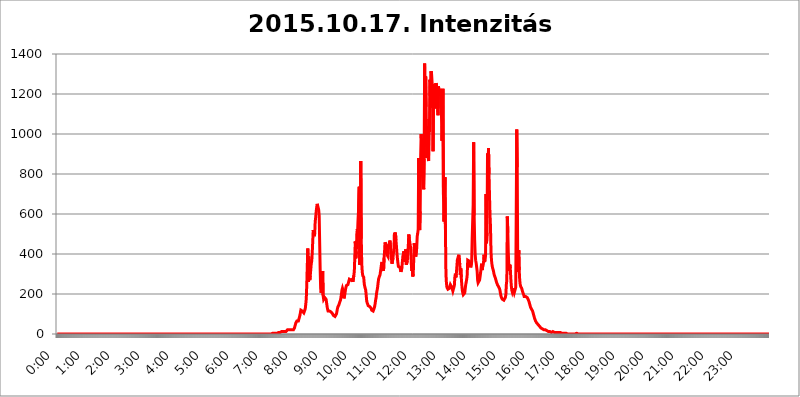
| Category | 2015.10.17. Intenzitás [W/m^2] |
|---|---|
| 0.0 | 0 |
| 0.0006944444444444445 | 0 |
| 0.001388888888888889 | 0 |
| 0.0020833333333333333 | 0 |
| 0.002777777777777778 | 0 |
| 0.003472222222222222 | 0 |
| 0.004166666666666667 | 0 |
| 0.004861111111111111 | 0 |
| 0.005555555555555556 | 0 |
| 0.0062499999999999995 | 0 |
| 0.006944444444444444 | 0 |
| 0.007638888888888889 | 0 |
| 0.008333333333333333 | 0 |
| 0.009027777777777779 | 0 |
| 0.009722222222222222 | 0 |
| 0.010416666666666666 | 0 |
| 0.011111111111111112 | 0 |
| 0.011805555555555555 | 0 |
| 0.012499999999999999 | 0 |
| 0.013194444444444444 | 0 |
| 0.013888888888888888 | 0 |
| 0.014583333333333332 | 0 |
| 0.015277777777777777 | 0 |
| 0.015972222222222224 | 0 |
| 0.016666666666666666 | 0 |
| 0.017361111111111112 | 0 |
| 0.018055555555555557 | 0 |
| 0.01875 | 0 |
| 0.019444444444444445 | 0 |
| 0.02013888888888889 | 0 |
| 0.020833333333333332 | 0 |
| 0.02152777777777778 | 0 |
| 0.022222222222222223 | 0 |
| 0.02291666666666667 | 0 |
| 0.02361111111111111 | 0 |
| 0.024305555555555556 | 0 |
| 0.024999999999999998 | 0 |
| 0.025694444444444447 | 0 |
| 0.02638888888888889 | 0 |
| 0.027083333333333334 | 0 |
| 0.027777777777777776 | 0 |
| 0.02847222222222222 | 0 |
| 0.029166666666666664 | 0 |
| 0.029861111111111113 | 0 |
| 0.030555555555555555 | 0 |
| 0.03125 | 0 |
| 0.03194444444444445 | 0 |
| 0.03263888888888889 | 0 |
| 0.03333333333333333 | 0 |
| 0.034027777777777775 | 0 |
| 0.034722222222222224 | 0 |
| 0.035416666666666666 | 0 |
| 0.036111111111111115 | 0 |
| 0.03680555555555556 | 0 |
| 0.0375 | 0 |
| 0.03819444444444444 | 0 |
| 0.03888888888888889 | 0 |
| 0.03958333333333333 | 0 |
| 0.04027777777777778 | 0 |
| 0.04097222222222222 | 0 |
| 0.041666666666666664 | 0 |
| 0.042361111111111106 | 0 |
| 0.04305555555555556 | 0 |
| 0.043750000000000004 | 0 |
| 0.044444444444444446 | 0 |
| 0.04513888888888889 | 0 |
| 0.04583333333333334 | 0 |
| 0.04652777777777778 | 0 |
| 0.04722222222222222 | 0 |
| 0.04791666666666666 | 0 |
| 0.04861111111111111 | 0 |
| 0.049305555555555554 | 0 |
| 0.049999999999999996 | 0 |
| 0.05069444444444445 | 0 |
| 0.051388888888888894 | 0 |
| 0.052083333333333336 | 0 |
| 0.05277777777777778 | 0 |
| 0.05347222222222222 | 0 |
| 0.05416666666666667 | 0 |
| 0.05486111111111111 | 0 |
| 0.05555555555555555 | 0 |
| 0.05625 | 0 |
| 0.05694444444444444 | 0 |
| 0.057638888888888885 | 0 |
| 0.05833333333333333 | 0 |
| 0.05902777777777778 | 0 |
| 0.059722222222222225 | 0 |
| 0.06041666666666667 | 0 |
| 0.061111111111111116 | 0 |
| 0.06180555555555556 | 0 |
| 0.0625 | 0 |
| 0.06319444444444444 | 0 |
| 0.06388888888888888 | 0 |
| 0.06458333333333334 | 0 |
| 0.06527777777777778 | 0 |
| 0.06597222222222222 | 0 |
| 0.06666666666666667 | 0 |
| 0.06736111111111111 | 0 |
| 0.06805555555555555 | 0 |
| 0.06874999999999999 | 0 |
| 0.06944444444444443 | 0 |
| 0.07013888888888889 | 0 |
| 0.07083333333333333 | 0 |
| 0.07152777777777779 | 0 |
| 0.07222222222222223 | 0 |
| 0.07291666666666667 | 0 |
| 0.07361111111111111 | 0 |
| 0.07430555555555556 | 0 |
| 0.075 | 0 |
| 0.07569444444444444 | 0 |
| 0.0763888888888889 | 0 |
| 0.07708333333333334 | 0 |
| 0.07777777777777778 | 0 |
| 0.07847222222222222 | 0 |
| 0.07916666666666666 | 0 |
| 0.0798611111111111 | 0 |
| 0.08055555555555556 | 0 |
| 0.08125 | 0 |
| 0.08194444444444444 | 0 |
| 0.08263888888888889 | 0 |
| 0.08333333333333333 | 0 |
| 0.08402777777777777 | 0 |
| 0.08472222222222221 | 0 |
| 0.08541666666666665 | 0 |
| 0.08611111111111112 | 0 |
| 0.08680555555555557 | 0 |
| 0.08750000000000001 | 0 |
| 0.08819444444444445 | 0 |
| 0.08888888888888889 | 0 |
| 0.08958333333333333 | 0 |
| 0.09027777777777778 | 0 |
| 0.09097222222222222 | 0 |
| 0.09166666666666667 | 0 |
| 0.09236111111111112 | 0 |
| 0.09305555555555556 | 0 |
| 0.09375 | 0 |
| 0.09444444444444444 | 0 |
| 0.09513888888888888 | 0 |
| 0.09583333333333333 | 0 |
| 0.09652777777777777 | 0 |
| 0.09722222222222222 | 0 |
| 0.09791666666666667 | 0 |
| 0.09861111111111111 | 0 |
| 0.09930555555555555 | 0 |
| 0.09999999999999999 | 0 |
| 0.10069444444444443 | 0 |
| 0.1013888888888889 | 0 |
| 0.10208333333333335 | 0 |
| 0.10277777777777779 | 0 |
| 0.10347222222222223 | 0 |
| 0.10416666666666667 | 0 |
| 0.10486111111111111 | 0 |
| 0.10555555555555556 | 0 |
| 0.10625 | 0 |
| 0.10694444444444444 | 0 |
| 0.1076388888888889 | 0 |
| 0.10833333333333334 | 0 |
| 0.10902777777777778 | 0 |
| 0.10972222222222222 | 0 |
| 0.1111111111111111 | 0 |
| 0.11180555555555556 | 0 |
| 0.11180555555555556 | 0 |
| 0.1125 | 0 |
| 0.11319444444444444 | 0 |
| 0.11388888888888889 | 0 |
| 0.11458333333333333 | 0 |
| 0.11527777777777777 | 0 |
| 0.11597222222222221 | 0 |
| 0.11666666666666665 | 0 |
| 0.1173611111111111 | 0 |
| 0.11805555555555557 | 0 |
| 0.11944444444444445 | 0 |
| 0.12013888888888889 | 0 |
| 0.12083333333333333 | 0 |
| 0.12152777777777778 | 0 |
| 0.12222222222222223 | 0 |
| 0.12291666666666667 | 0 |
| 0.12291666666666667 | 0 |
| 0.12361111111111112 | 0 |
| 0.12430555555555556 | 0 |
| 0.125 | 0 |
| 0.12569444444444444 | 0 |
| 0.12638888888888888 | 0 |
| 0.12708333333333333 | 0 |
| 0.16875 | 0 |
| 0.12847222222222224 | 0 |
| 0.12916666666666668 | 0 |
| 0.12986111111111112 | 0 |
| 0.13055555555555556 | 0 |
| 0.13125 | 0 |
| 0.13194444444444445 | 0 |
| 0.1326388888888889 | 0 |
| 0.13333333333333333 | 0 |
| 0.13402777777777777 | 0 |
| 0.13402777777777777 | 0 |
| 0.13472222222222222 | 0 |
| 0.13541666666666666 | 0 |
| 0.1361111111111111 | 0 |
| 0.13749999999999998 | 0 |
| 0.13819444444444443 | 0 |
| 0.1388888888888889 | 0 |
| 0.13958333333333334 | 0 |
| 0.14027777777777778 | 0 |
| 0.14097222222222222 | 0 |
| 0.14166666666666666 | 0 |
| 0.1423611111111111 | 0 |
| 0.14305555555555557 | 0 |
| 0.14375000000000002 | 0 |
| 0.14444444444444446 | 0 |
| 0.1451388888888889 | 0 |
| 0.1451388888888889 | 0 |
| 0.14652777777777778 | 0 |
| 0.14722222222222223 | 0 |
| 0.14791666666666667 | 0 |
| 0.1486111111111111 | 0 |
| 0.14930555555555555 | 0 |
| 0.15 | 0 |
| 0.15069444444444444 | 0 |
| 0.15138888888888888 | 0 |
| 0.15208333333333332 | 0 |
| 0.15277777777777776 | 0 |
| 0.15347222222222223 | 0 |
| 0.15416666666666667 | 0 |
| 0.15486111111111112 | 0 |
| 0.15555555555555556 | 0 |
| 0.15625 | 0 |
| 0.15694444444444444 | 0 |
| 0.15763888888888888 | 0 |
| 0.15833333333333333 | 0 |
| 0.15902777777777777 | 0 |
| 0.15972222222222224 | 0 |
| 0.16041666666666668 | 0 |
| 0.16111111111111112 | 0 |
| 0.16180555555555556 | 0 |
| 0.1625 | 0 |
| 0.16319444444444445 | 0 |
| 0.1638888888888889 | 0 |
| 0.16458333333333333 | 0 |
| 0.16527777777777777 | 0 |
| 0.16597222222222222 | 0 |
| 0.16666666666666666 | 0 |
| 0.1673611111111111 | 0 |
| 0.16805555555555554 | 0 |
| 0.16874999999999998 | 0 |
| 0.16944444444444443 | 0 |
| 0.17013888888888887 | 0 |
| 0.1708333333333333 | 0 |
| 0.17152777777777775 | 0 |
| 0.17222222222222225 | 0 |
| 0.1729166666666667 | 0 |
| 0.17361111111111113 | 0 |
| 0.17430555555555557 | 0 |
| 0.17500000000000002 | 0 |
| 0.17569444444444446 | 0 |
| 0.1763888888888889 | 0 |
| 0.17708333333333334 | 0 |
| 0.17777777777777778 | 0 |
| 0.17847222222222223 | 0 |
| 0.17916666666666667 | 0 |
| 0.1798611111111111 | 0 |
| 0.18055555555555555 | 0 |
| 0.18125 | 0 |
| 0.18194444444444444 | 0 |
| 0.1826388888888889 | 0 |
| 0.18333333333333335 | 0 |
| 0.1840277777777778 | 0 |
| 0.18472222222222223 | 0 |
| 0.18541666666666667 | 0 |
| 0.18611111111111112 | 0 |
| 0.18680555555555556 | 0 |
| 0.1875 | 0 |
| 0.18819444444444444 | 0 |
| 0.18888888888888888 | 0 |
| 0.18958333333333333 | 0 |
| 0.19027777777777777 | 0 |
| 0.1909722222222222 | 0 |
| 0.19166666666666665 | 0 |
| 0.19236111111111112 | 0 |
| 0.19305555555555554 | 0 |
| 0.19375 | 0 |
| 0.19444444444444445 | 0 |
| 0.1951388888888889 | 0 |
| 0.19583333333333333 | 0 |
| 0.19652777777777777 | 0 |
| 0.19722222222222222 | 0 |
| 0.19791666666666666 | 0 |
| 0.1986111111111111 | 0 |
| 0.19930555555555554 | 0 |
| 0.19999999999999998 | 0 |
| 0.20069444444444443 | 0 |
| 0.20138888888888887 | 0 |
| 0.2020833333333333 | 0 |
| 0.2027777777777778 | 0 |
| 0.2034722222222222 | 0 |
| 0.2041666666666667 | 0 |
| 0.20486111111111113 | 0 |
| 0.20555555555555557 | 0 |
| 0.20625000000000002 | 0 |
| 0.20694444444444446 | 0 |
| 0.2076388888888889 | 0 |
| 0.20833333333333334 | 0 |
| 0.20902777777777778 | 0 |
| 0.20972222222222223 | 0 |
| 0.21041666666666667 | 0 |
| 0.2111111111111111 | 0 |
| 0.21180555555555555 | 0 |
| 0.2125 | 0 |
| 0.21319444444444444 | 0 |
| 0.2138888888888889 | 0 |
| 0.21458333333333335 | 0 |
| 0.2152777777777778 | 0 |
| 0.21597222222222223 | 0 |
| 0.21666666666666667 | 0 |
| 0.21736111111111112 | 0 |
| 0.21805555555555556 | 0 |
| 0.21875 | 0 |
| 0.21944444444444444 | 0 |
| 0.22013888888888888 | 0 |
| 0.22083333333333333 | 0 |
| 0.22152777777777777 | 0 |
| 0.2222222222222222 | 0 |
| 0.22291666666666665 | 0 |
| 0.2236111111111111 | 0 |
| 0.22430555555555556 | 0 |
| 0.225 | 0 |
| 0.22569444444444445 | 0 |
| 0.2263888888888889 | 0 |
| 0.22708333333333333 | 0 |
| 0.22777777777777777 | 0 |
| 0.22847222222222222 | 0 |
| 0.22916666666666666 | 0 |
| 0.2298611111111111 | 0 |
| 0.23055555555555554 | 0 |
| 0.23124999999999998 | 0 |
| 0.23194444444444443 | 0 |
| 0.23263888888888887 | 0 |
| 0.2333333333333333 | 0 |
| 0.2340277777777778 | 0 |
| 0.2347222222222222 | 0 |
| 0.2354166666666667 | 0 |
| 0.23611111111111113 | 0 |
| 0.23680555555555557 | 0 |
| 0.23750000000000002 | 0 |
| 0.23819444444444446 | 0 |
| 0.2388888888888889 | 0 |
| 0.23958333333333334 | 0 |
| 0.24027777777777778 | 0 |
| 0.24097222222222223 | 0 |
| 0.24166666666666667 | 0 |
| 0.2423611111111111 | 0 |
| 0.24305555555555555 | 0 |
| 0.24375 | 0 |
| 0.24444444444444446 | 0 |
| 0.24513888888888888 | 0 |
| 0.24583333333333335 | 0 |
| 0.2465277777777778 | 0 |
| 0.24722222222222223 | 0 |
| 0.24791666666666667 | 0 |
| 0.24861111111111112 | 0 |
| 0.24930555555555556 | 0 |
| 0.25 | 0 |
| 0.25069444444444444 | 0 |
| 0.2513888888888889 | 0 |
| 0.2520833333333333 | 0 |
| 0.25277777777777777 | 0 |
| 0.2534722222222222 | 0 |
| 0.25416666666666665 | 0 |
| 0.2548611111111111 | 0 |
| 0.2555555555555556 | 0 |
| 0.25625000000000003 | 0 |
| 0.2569444444444445 | 0 |
| 0.2576388888888889 | 0 |
| 0.25833333333333336 | 0 |
| 0.2590277777777778 | 0 |
| 0.25972222222222224 | 0 |
| 0.2604166666666667 | 0 |
| 0.2611111111111111 | 0 |
| 0.26180555555555557 | 0 |
| 0.2625 | 0 |
| 0.26319444444444445 | 0 |
| 0.2638888888888889 | 0 |
| 0.26458333333333334 | 0 |
| 0.2652777777777778 | 0 |
| 0.2659722222222222 | 0 |
| 0.26666666666666666 | 0 |
| 0.2673611111111111 | 0 |
| 0.26805555555555555 | 0 |
| 0.26875 | 0 |
| 0.26944444444444443 | 0 |
| 0.2701388888888889 | 0 |
| 0.2708333333333333 | 0 |
| 0.27152777777777776 | 0 |
| 0.2722222222222222 | 0 |
| 0.27291666666666664 | 0 |
| 0.2736111111111111 | 0 |
| 0.2743055555555555 | 0 |
| 0.27499999999999997 | 0 |
| 0.27569444444444446 | 0 |
| 0.27638888888888885 | 0 |
| 0.27708333333333335 | 0 |
| 0.2777777777777778 | 0 |
| 0.27847222222222223 | 0 |
| 0.2791666666666667 | 0 |
| 0.2798611111111111 | 0 |
| 0.28055555555555556 | 0 |
| 0.28125 | 0 |
| 0.28194444444444444 | 0 |
| 0.2826388888888889 | 0 |
| 0.2833333333333333 | 0 |
| 0.28402777777777777 | 0 |
| 0.2847222222222222 | 0 |
| 0.28541666666666665 | 0 |
| 0.28611111111111115 | 0 |
| 0.28680555555555554 | 0 |
| 0.28750000000000003 | 0 |
| 0.2881944444444445 | 0 |
| 0.2888888888888889 | 0 |
| 0.28958333333333336 | 0 |
| 0.2902777777777778 | 0 |
| 0.29097222222222224 | 0 |
| 0.2916666666666667 | 0 |
| 0.2923611111111111 | 0 |
| 0.29305555555555557 | 0 |
| 0.29375 | 0 |
| 0.29444444444444445 | 0 |
| 0.2951388888888889 | 0 |
| 0.29583333333333334 | 0 |
| 0.2965277777777778 | 0 |
| 0.2972222222222222 | 0 |
| 0.29791666666666666 | 0 |
| 0.2986111111111111 | 0 |
| 0.29930555555555555 | 0 |
| 0.3 | 0 |
| 0.30069444444444443 | 3.525 |
| 0.3013888888888889 | 3.525 |
| 0.3020833333333333 | 3.525 |
| 0.30277777777777776 | 3.525 |
| 0.3034722222222222 | 3.525 |
| 0.30416666666666664 | 3.525 |
| 0.3048611111111111 | 3.525 |
| 0.3055555555555555 | 3.525 |
| 0.30624999999999997 | 3.525 |
| 0.3069444444444444 | 3.525 |
| 0.3076388888888889 | 3.525 |
| 0.30833333333333335 | 3.525 |
| 0.3090277777777778 | 7.887 |
| 0.30972222222222223 | 3.525 |
| 0.3104166666666667 | 7.887 |
| 0.3111111111111111 | 7.887 |
| 0.31180555555555556 | 7.887 |
| 0.3125 | 7.887 |
| 0.31319444444444444 | 12.257 |
| 0.3138888888888889 | 12.257 |
| 0.3145833333333333 | 12.257 |
| 0.31527777777777777 | 12.257 |
| 0.3159722222222222 | 12.257 |
| 0.31666666666666665 | 12.257 |
| 0.31736111111111115 | 12.257 |
| 0.31805555555555554 | 12.257 |
| 0.31875000000000003 | 12.257 |
| 0.3194444444444445 | 12.257 |
| 0.3201388888888889 | 12.257 |
| 0.32083333333333336 | 12.257 |
| 0.3215277777777778 | 16.636 |
| 0.32222222222222224 | 16.636 |
| 0.3229166666666667 | 21.024 |
| 0.3236111111111111 | 21.024 |
| 0.32430555555555557 | 21.024 |
| 0.325 | 21.024 |
| 0.32569444444444445 | 21.024 |
| 0.3263888888888889 | 25.419 |
| 0.32708333333333334 | 21.024 |
| 0.3277777777777778 | 21.024 |
| 0.3284722222222222 | 21.024 |
| 0.32916666666666666 | 21.024 |
| 0.3298611111111111 | 16.636 |
| 0.33055555555555555 | 16.636 |
| 0.33125 | 21.024 |
| 0.33194444444444443 | 21.024 |
| 0.3326388888888889 | 29.823 |
| 0.3333333333333333 | 38.653 |
| 0.3340277777777778 | 47.511 |
| 0.3347222222222222 | 56.398 |
| 0.3354166666666667 | 60.85 |
| 0.3361111111111111 | 65.31 |
| 0.3368055555555556 | 65.31 |
| 0.33749999999999997 | 65.31 |
| 0.33819444444444446 | 65.31 |
| 0.33888888888888885 | 74.246 |
| 0.33958333333333335 | 83.205 |
| 0.34027777777777773 | 92.184 |
| 0.34097222222222223 | 105.69 |
| 0.3416666666666666 | 119.235 |
| 0.3423611111111111 | 123.758 |
| 0.3430555555555555 | 119.235 |
| 0.34375 | 114.716 |
| 0.3444444444444445 | 110.201 |
| 0.3451388888888889 | 110.201 |
| 0.3458333333333334 | 105.69 |
| 0.34652777777777777 | 110.201 |
| 0.34722222222222227 | 119.235 |
| 0.34791666666666665 | 128.284 |
| 0.34861111111111115 | 150.964 |
| 0.34930555555555554 | 178.264 |
| 0.35000000000000003 | 251.251 |
| 0.3506944444444444 | 255.813 |
| 0.3513888888888889 | 427.39 |
| 0.3520833333333333 | 260.373 |
| 0.3527777777777778 | 387.202 |
| 0.3534722222222222 | 314.98 |
| 0.3541666666666667 | 269.49 |
| 0.3548611111111111 | 292.259 |
| 0.35555555555555557 | 287.709 |
| 0.35625 | 351.198 |
| 0.35694444444444445 | 364.728 |
| 0.3576388888888889 | 405.108 |
| 0.35833333333333334 | 462.786 |
| 0.3590277777777778 | 519.555 |
| 0.3597222222222222 | 506.542 |
| 0.36041666666666666 | 489.108 |
| 0.3611111111111111 | 502.192 |
| 0.36180555555555555 | 562.53 |
| 0.3625 | 583.779 |
| 0.36319444444444443 | 613.252 |
| 0.3638888888888889 | 634.105 |
| 0.3645833333333333 | 650.667 |
| 0.3652777777777778 | 642.4 |
| 0.3659722222222222 | 638.256 |
| 0.3666666666666667 | 621.613 |
| 0.3673611111111111 | 592.233 |
| 0.3680555555555556 | 592.233 |
| 0.36874999999999997 | 324.052 |
| 0.36944444444444446 | 228.436 |
| 0.37013888888888885 | 205.62 |
| 0.37083333333333335 | 223.873 |
| 0.37152777777777773 | 274.047 |
| 0.37222222222222223 | 314.98 |
| 0.3729166666666666 | 191.937 |
| 0.3736111111111111 | 173.709 |
| 0.3743055555555555 | 173.709 |
| 0.375 | 182.82 |
| 0.3756944444444445 | 187.378 |
| 0.3763888888888889 | 182.82 |
| 0.3770833333333334 | 173.709 |
| 0.37777777777777777 | 155.509 |
| 0.37847222222222227 | 137.347 |
| 0.37916666666666665 | 123.758 |
| 0.37986111111111115 | 114.716 |
| 0.38055555555555554 | 114.716 |
| 0.38125000000000003 | 114.716 |
| 0.3819444444444444 | 114.716 |
| 0.3826388888888889 | 110.201 |
| 0.3833333333333333 | 110.201 |
| 0.3840277777777778 | 110.201 |
| 0.3847222222222222 | 105.69 |
| 0.3854166666666667 | 105.69 |
| 0.3861111111111111 | 101.184 |
| 0.38680555555555557 | 96.682 |
| 0.3875 | 92.184 |
| 0.38819444444444445 | 87.692 |
| 0.3888888888888889 | 87.692 |
| 0.38958333333333334 | 87.692 |
| 0.3902777777777778 | 92.184 |
| 0.3909722222222222 | 92.184 |
| 0.39166666666666666 | 101.184 |
| 0.3923611111111111 | 114.716 |
| 0.39305555555555555 | 128.284 |
| 0.39375 | 137.347 |
| 0.39444444444444443 | 141.884 |
| 0.3951388888888889 | 146.423 |
| 0.3958333333333333 | 155.509 |
| 0.3965277777777778 | 160.056 |
| 0.3972222222222222 | 169.156 |
| 0.3979166666666667 | 182.82 |
| 0.3986111111111111 | 201.058 |
| 0.3993055555555556 | 219.309 |
| 0.39999999999999997 | 228.436 |
| 0.40069444444444446 | 219.309 |
| 0.40138888888888885 | 191.937 |
| 0.40208333333333335 | 178.264 |
| 0.40277777777777773 | 187.378 |
| 0.40347222222222223 | 201.058 |
| 0.4041666666666666 | 219.309 |
| 0.4048611111111111 | 233 |
| 0.4055555555555555 | 242.127 |
| 0.40625 | 246.689 |
| 0.4069444444444445 | 246.689 |
| 0.4076388888888889 | 246.689 |
| 0.4083333333333334 | 251.251 |
| 0.40902777777777777 | 264.932 |
| 0.40972222222222227 | 274.047 |
| 0.41041666666666665 | 278.603 |
| 0.41111111111111115 | 278.603 |
| 0.41180555555555554 | 269.49 |
| 0.41250000000000003 | 269.49 |
| 0.4131944444444444 | 274.047 |
| 0.4138888888888889 | 274.047 |
| 0.4145833333333333 | 260.373 |
| 0.4152777777777778 | 264.932 |
| 0.4159722222222222 | 292.259 |
| 0.4166666666666667 | 314.98 |
| 0.4173611111111111 | 319.517 |
| 0.41805555555555557 | 462.786 |
| 0.41875 | 378.224 |
| 0.41944444444444445 | 414.035 |
| 0.4201388888888889 | 497.836 |
| 0.42083333333333334 | 523.88 |
| 0.4215277777777778 | 502.192 |
| 0.4222222222222222 | 497.836 |
| 0.42291666666666666 | 497.836 |
| 0.4236111111111111 | 735.89 |
| 0.42430555555555555 | 346.682 |
| 0.425 | 427.39 |
| 0.42569444444444443 | 864.493 |
| 0.4263888888888889 | 475.972 |
| 0.4270833333333333 | 351.198 |
| 0.4277777777777778 | 310.44 |
| 0.4284722222222222 | 292.259 |
| 0.4291666666666667 | 296.808 |
| 0.4298611111111111 | 283.156 |
| 0.4305555555555556 | 251.251 |
| 0.43124999999999997 | 237.564 |
| 0.43194444444444446 | 233 |
| 0.43263888888888885 | 219.309 |
| 0.43333333333333335 | 191.937 |
| 0.43402777777777773 | 164.605 |
| 0.43472222222222223 | 155.509 |
| 0.4354166666666666 | 150.964 |
| 0.4361111111111111 | 141.884 |
| 0.4368055555555555 | 137.347 |
| 0.4375 | 137.347 |
| 0.4381944444444445 | 137.347 |
| 0.4388888888888889 | 141.884 |
| 0.4395833333333334 | 141.884 |
| 0.44027777777777777 | 128.284 |
| 0.44097222222222227 | 119.235 |
| 0.44166666666666665 | 119.235 |
| 0.44236111111111115 | 119.235 |
| 0.44305555555555554 | 114.716 |
| 0.44375000000000003 | 119.235 |
| 0.4444444444444444 | 128.284 |
| 0.4451388888888889 | 137.347 |
| 0.4458333333333333 | 150.964 |
| 0.4465277777777778 | 169.156 |
| 0.4472222222222222 | 182.82 |
| 0.4479166666666667 | 205.62 |
| 0.4486111111111111 | 219.309 |
| 0.44930555555555557 | 233 |
| 0.45 | 255.813 |
| 0.45069444444444445 | 274.047 |
| 0.4513888888888889 | 283.156 |
| 0.45208333333333334 | 278.603 |
| 0.4527777777777778 | 296.808 |
| 0.4534722222222222 | 314.98 |
| 0.45416666666666666 | 333.113 |
| 0.4548611111111111 | 351.198 |
| 0.45555555555555555 | 360.221 |
| 0.45625 | 337.639 |
| 0.45694444444444443 | 333.113 |
| 0.4576388888888889 | 314.98 |
| 0.4583333333333333 | 378.224 |
| 0.4590277777777778 | 409.574 |
| 0.4597222222222222 | 458.38 |
| 0.4604166666666667 | 458.38 |
| 0.4611111111111111 | 445.129 |
| 0.4618055555555556 | 422.943 |
| 0.46249999999999997 | 396.164 |
| 0.46319444444444446 | 391.685 |
| 0.46388888888888885 | 387.202 |
| 0.46458333333333335 | 436.27 |
| 0.46527777777777773 | 440.702 |
| 0.46597222222222223 | 458.38 |
| 0.4666666666666666 | 467.187 |
| 0.4673611111111111 | 436.27 |
| 0.4680555555555555 | 414.035 |
| 0.46875 | 378.224 |
| 0.4694444444444445 | 351.198 |
| 0.4701388888888889 | 355.712 |
| 0.4708333333333334 | 378.224 |
| 0.47152777777777777 | 405.108 |
| 0.47222222222222227 | 427.39 |
| 0.47291666666666665 | 506.542 |
| 0.47361111111111115 | 489.108 |
| 0.47430555555555554 | 506.542 |
| 0.47500000000000003 | 471.582 |
| 0.4756944444444444 | 440.702 |
| 0.4763888888888889 | 405.108 |
| 0.4770833333333333 | 378.224 |
| 0.4777777777777778 | 355.712 |
| 0.4784722222222222 | 337.639 |
| 0.4791666666666667 | 333.113 |
| 0.4798611111111111 | 337.639 |
| 0.48055555555555557 | 333.113 |
| 0.48125 | 324.052 |
| 0.48194444444444445 | 310.44 |
| 0.4826388888888889 | 314.98 |
| 0.48333333333333334 | 328.584 |
| 0.4840277777777778 | 360.221 |
| 0.4847222222222222 | 387.202 |
| 0.48541666666666666 | 391.685 |
| 0.4861111111111111 | 414.035 |
| 0.48680555555555555 | 409.574 |
| 0.4875 | 387.202 |
| 0.48819444444444443 | 360.221 |
| 0.4888888888888889 | 422.943 |
| 0.4895833333333333 | 346.682 |
| 0.4902777777777778 | 351.198 |
| 0.4909722222222222 | 364.728 |
| 0.4916666666666667 | 405.108 |
| 0.4923611111111111 | 440.702 |
| 0.4930555555555556 | 497.836 |
| 0.49374999999999997 | 475.972 |
| 0.49444444444444446 | 458.38 |
| 0.49513888888888885 | 445.129 |
| 0.49583333333333335 | 414.035 |
| 0.49652777777777773 | 355.712 |
| 0.49722222222222223 | 314.98 |
| 0.4979166666666666 | 324.052 |
| 0.4986111111111111 | 287.709 |
| 0.4993055555555555 | 301.354 |
| 0.5 | 373.729 |
| 0.5006944444444444 | 453.968 |
| 0.5013888888888889 | 427.39 |
| 0.5020833333333333 | 414.035 |
| 0.5027777777777778 | 387.202 |
| 0.5034722222222222 | 382.715 |
| 0.5041666666666667 | 431.833 |
| 0.5048611111111111 | 489.108 |
| 0.5055555555555555 | 502.192 |
| 0.50625 | 523.88 |
| 0.5069444444444444 | 879.719 |
| 0.5076388888888889 | 592.233 |
| 0.5083333333333333 | 519.555 |
| 0.5090277777777777 | 613.252 |
| 0.5097222222222222 | 891.099 |
| 0.5104166666666666 | 999.916 |
| 0.5111111111111112 | 947.58 |
| 0.5118055555555555 | 925.06 |
| 0.5125000000000001 | 826.123 |
| 0.5131944444444444 | 860.676 |
| 0.513888888888889 | 723.889 |
| 0.5145833333333333 | 875.918 |
| 0.5152777777777778 | 1352.994 |
| 0.5159722222222222 | 992.448 |
| 0.5166666666666667 | 1287.761 |
| 0.517361111111111 | 1135.543 |
| 0.5180555555555556 | 879.719 |
| 0.5187499999999999 | 1037.277 |
| 0.5194444444444445 | 928.819 |
| 0.5201388888888888 | 887.309 |
| 0.5208333333333334 | 864.493 |
| 0.5215277777777778 | 1074.789 |
| 0.5222222222222223 | 1011.118 |
| 0.5229166666666667 | 1270.964 |
| 0.5236111111111111 | 1131.708 |
| 0.5243055555555556 | 1313.406 |
| 0.525 | 1300.514 |
| 0.5256944444444445 | 1258.511 |
| 0.5263888888888889 | 1229.899 |
| 0.5270833333333333 | 913.766 |
| 0.5277777777777778 | 1221.83 |
| 0.5284722222222222 | 1250.275 |
| 0.5291666666666667 | 1238.014 |
| 0.5298611111111111 | 1233.951 |
| 0.5305555555555556 | 1127.879 |
| 0.53125 | 1254.387 |
| 0.5319444444444444 | 1242.089 |
| 0.5326388888888889 | 1217.812 |
| 0.5333333333333333 | 1213.804 |
| 0.5340277777777778 | 1093.653 |
| 0.5347222222222222 | 1238.014 |
| 0.5354166666666667 | 1213.804 |
| 0.5361111111111111 | 1189.969 |
| 0.5368055555555555 | 1217.812 |
| 0.5375 | 1225.859 |
| 0.5381944444444444 | 1225.859 |
| 0.5388888888888889 | 1093.653 |
| 0.5395833333333333 | 966.295 |
| 0.5402777777777777 | 1056.004 |
| 0.5409722222222222 | 1225.859 |
| 0.5416666666666666 | 695.666 |
| 0.5423611111111112 | 562.53 |
| 0.5430555555555555 | 566.793 |
| 0.5437500000000001 | 783.342 |
| 0.5444444444444444 | 519.555 |
| 0.545138888888889 | 301.354 |
| 0.5458333333333333 | 255.813 |
| 0.5465277777777778 | 233 |
| 0.5472222222222222 | 228.436 |
| 0.5479166666666667 | 223.873 |
| 0.548611111111111 | 219.309 |
| 0.5493055555555556 | 223.873 |
| 0.5499999999999999 | 228.436 |
| 0.5506944444444445 | 233 |
| 0.5513888888888888 | 246.689 |
| 0.5520833333333334 | 251.251 |
| 0.5527777777777778 | 237.564 |
| 0.5534722222222223 | 233 |
| 0.5541666666666667 | 223.873 |
| 0.5548611111111111 | 214.746 |
| 0.5555555555555556 | 210.182 |
| 0.55625 | 219.309 |
| 0.5569444444444445 | 242.127 |
| 0.5576388888888889 | 283.156 |
| 0.5583333333333333 | 301.354 |
| 0.5590277777777778 | 283.156 |
| 0.5597222222222222 | 301.354 |
| 0.5604166666666667 | 333.113 |
| 0.5611111111111111 | 369.23 |
| 0.5618055555555556 | 378.224 |
| 0.5625 | 387.202 |
| 0.5631944444444444 | 396.164 |
| 0.5638888888888889 | 391.685 |
| 0.5645833333333333 | 346.682 |
| 0.5652777777777778 | 296.808 |
| 0.5659722222222222 | 328.584 |
| 0.5666666666666667 | 283.156 |
| 0.5673611111111111 | 246.689 |
| 0.5680555555555555 | 219.309 |
| 0.56875 | 205.62 |
| 0.5694444444444444 | 196.497 |
| 0.5701388888888889 | 191.937 |
| 0.5708333333333333 | 196.497 |
| 0.5715277777777777 | 205.62 |
| 0.5722222222222222 | 228.436 |
| 0.5729166666666666 | 246.689 |
| 0.5736111111111112 | 260.373 |
| 0.5743055555555555 | 274.047 |
| 0.5750000000000001 | 296.808 |
| 0.5756944444444444 | 369.23 |
| 0.576388888888889 | 373.729 |
| 0.5770833333333333 | 369.23 |
| 0.5777777777777778 | 364.728 |
| 0.5784722222222222 | 351.198 |
| 0.5791666666666667 | 342.162 |
| 0.579861111111111 | 333.113 |
| 0.5805555555555556 | 337.639 |
| 0.5812499999999999 | 360.221 |
| 0.5819444444444445 | 475.972 |
| 0.5826388888888888 | 480.356 |
| 0.5833333333333334 | 646.537 |
| 0.5840277777777778 | 958.814 |
| 0.5847222222222223 | 592.233 |
| 0.5854166666666667 | 471.582 |
| 0.5861111111111111 | 400.638 |
| 0.5868055555555556 | 369.23 |
| 0.5875 | 355.712 |
| 0.5881944444444445 | 355.712 |
| 0.5888888888888889 | 314.98 |
| 0.5895833333333333 | 269.49 |
| 0.5902777777777778 | 255.813 |
| 0.5909722222222222 | 251.251 |
| 0.5916666666666667 | 260.373 |
| 0.5923611111111111 | 269.49 |
| 0.5930555555555556 | 287.709 |
| 0.59375 | 305.898 |
| 0.5944444444444444 | 328.584 |
| 0.5951388888888889 | 351.198 |
| 0.5958333333333333 | 319.517 |
| 0.5965277777777778 | 333.113 |
| 0.5972222222222222 | 342.162 |
| 0.5979166666666667 | 360.221 |
| 0.5986111111111111 | 396.164 |
| 0.5993055555555555 | 360.221 |
| 0.6 | 369.23 |
| 0.6006944444444444 | 391.685 |
| 0.6013888888888889 | 699.717 |
| 0.6020833333333333 | 453.968 |
| 0.6027777777777777 | 506.542 |
| 0.6034722222222222 | 902.447 |
| 0.6041666666666666 | 767.62 |
| 0.6048611111111112 | 928.819 |
| 0.6055555555555555 | 798.974 |
| 0.6062500000000001 | 691.608 |
| 0.6069444444444444 | 596.45 |
| 0.607638888888889 | 536.82 |
| 0.6083333333333333 | 414.035 |
| 0.6090277777777778 | 369.23 |
| 0.6097222222222222 | 346.682 |
| 0.6104166666666667 | 333.113 |
| 0.611111111111111 | 324.052 |
| 0.6118055555555556 | 314.98 |
| 0.6124999999999999 | 301.354 |
| 0.6131944444444445 | 292.259 |
| 0.6138888888888888 | 287.709 |
| 0.6145833333333334 | 278.603 |
| 0.6152777777777778 | 269.49 |
| 0.6159722222222223 | 260.373 |
| 0.6166666666666667 | 255.813 |
| 0.6173611111111111 | 246.689 |
| 0.6180555555555556 | 242.127 |
| 0.61875 | 237.564 |
| 0.6194444444444445 | 237.564 |
| 0.6201388888888889 | 228.436 |
| 0.6208333333333333 | 219.309 |
| 0.6215277777777778 | 205.62 |
| 0.6222222222222222 | 191.937 |
| 0.6229166666666667 | 182.82 |
| 0.6236111111111111 | 178.264 |
| 0.6243055555555556 | 173.709 |
| 0.625 | 173.709 |
| 0.6256944444444444 | 169.156 |
| 0.6263888888888889 | 169.156 |
| 0.6270833333333333 | 169.156 |
| 0.6277777777777778 | 173.709 |
| 0.6284722222222222 | 182.82 |
| 0.6291666666666667 | 196.497 |
| 0.6298611111111111 | 246.689 |
| 0.6305555555555555 | 269.49 |
| 0.63125 | 588.009 |
| 0.6319444444444444 | 506.542 |
| 0.6326388888888889 | 405.108 |
| 0.6333333333333333 | 342.162 |
| 0.6340277777777777 | 314.98 |
| 0.6347222222222222 | 346.682 |
| 0.6354166666666666 | 328.584 |
| 0.6361111111111112 | 278.603 |
| 0.6368055555555555 | 242.127 |
| 0.6375000000000001 | 219.309 |
| 0.6381944444444444 | 210.182 |
| 0.638888888888889 | 205.62 |
| 0.6395833333333333 | 228.436 |
| 0.6402777777777778 | 214.746 |
| 0.6409722222222222 | 205.62 |
| 0.6416666666666667 | 201.058 |
| 0.642361111111111 | 210.182 |
| 0.6430555555555556 | 233 |
| 0.6437499999999999 | 609.062 |
| 0.6444444444444445 | 1022.323 |
| 0.6451388888888888 | 833.834 |
| 0.6458333333333334 | 337.639 |
| 0.6465277777777778 | 310.44 |
| 0.6472222222222223 | 418.492 |
| 0.6479166666666667 | 319.517 |
| 0.6486111111111111 | 269.49 |
| 0.6493055555555556 | 246.689 |
| 0.65 | 237.564 |
| 0.6506944444444445 | 233 |
| 0.6513888888888889 | 228.436 |
| 0.6520833333333333 | 219.309 |
| 0.6527777777777778 | 210.182 |
| 0.6534722222222222 | 205.62 |
| 0.6541666666666667 | 196.497 |
| 0.6548611111111111 | 187.378 |
| 0.6555555555555556 | 187.378 |
| 0.65625 | 187.378 |
| 0.6569444444444444 | 187.378 |
| 0.6576388888888889 | 187.378 |
| 0.6583333333333333 | 187.378 |
| 0.6590277777777778 | 182.82 |
| 0.6597222222222222 | 182.82 |
| 0.6604166666666667 | 173.709 |
| 0.6611111111111111 | 169.156 |
| 0.6618055555555555 | 160.056 |
| 0.6625 | 150.964 |
| 0.6631944444444444 | 141.884 |
| 0.6638888888888889 | 132.814 |
| 0.6645833333333333 | 128.284 |
| 0.6652777777777777 | 123.758 |
| 0.6659722222222222 | 119.235 |
| 0.6666666666666666 | 114.716 |
| 0.6673611111111111 | 110.201 |
| 0.6680555555555556 | 96.682 |
| 0.6687500000000001 | 87.692 |
| 0.6694444444444444 | 78.722 |
| 0.6701388888888888 | 74.246 |
| 0.6708333333333334 | 65.31 |
| 0.6715277777777778 | 60.85 |
| 0.6722222222222222 | 56.398 |
| 0.6729166666666666 | 56.398 |
| 0.6736111111111112 | 51.951 |
| 0.6743055555555556 | 47.511 |
| 0.6749999999999999 | 47.511 |
| 0.6756944444444444 | 43.079 |
| 0.6763888888888889 | 38.653 |
| 0.6770833333333334 | 38.653 |
| 0.6777777777777777 | 34.234 |
| 0.6784722222222223 | 29.823 |
| 0.6791666666666667 | 29.823 |
| 0.6798611111111111 | 29.823 |
| 0.6805555555555555 | 25.419 |
| 0.68125 | 25.419 |
| 0.6819444444444445 | 25.419 |
| 0.6826388888888889 | 21.024 |
| 0.6833333333333332 | 21.024 |
| 0.6840277777777778 | 21.024 |
| 0.6847222222222222 | 21.024 |
| 0.6854166666666667 | 21.024 |
| 0.686111111111111 | 16.636 |
| 0.6868055555555556 | 16.636 |
| 0.6875 | 16.636 |
| 0.6881944444444444 | 12.257 |
| 0.688888888888889 | 12.257 |
| 0.6895833333333333 | 12.257 |
| 0.6902777777777778 | 12.257 |
| 0.6909722222222222 | 12.257 |
| 0.6916666666666668 | 12.257 |
| 0.6923611111111111 | 12.257 |
| 0.6930555555555555 | 7.887 |
| 0.69375 | 7.887 |
| 0.6944444444444445 | 7.887 |
| 0.6951388888888889 | 12.257 |
| 0.6958333333333333 | 7.887 |
| 0.6965277777777777 | 7.887 |
| 0.6972222222222223 | 7.887 |
| 0.6979166666666666 | 7.887 |
| 0.6986111111111111 | 7.887 |
| 0.6993055555555556 | 7.887 |
| 0.7000000000000001 | 7.887 |
| 0.7006944444444444 | 7.887 |
| 0.7013888888888888 | 7.887 |
| 0.7020833333333334 | 7.887 |
| 0.7027777777777778 | 7.887 |
| 0.7034722222222222 | 7.887 |
| 0.7041666666666666 | 7.887 |
| 0.7048611111111112 | 7.887 |
| 0.7055555555555556 | 7.887 |
| 0.7062499999999999 | 3.525 |
| 0.7069444444444444 | 3.525 |
| 0.7076388888888889 | 3.525 |
| 0.7083333333333334 | 3.525 |
| 0.7090277777777777 | 3.525 |
| 0.7097222222222223 | 3.525 |
| 0.7104166666666667 | 3.525 |
| 0.7111111111111111 | 3.525 |
| 0.7118055555555555 | 3.525 |
| 0.7125 | 3.525 |
| 0.7131944444444445 | 3.525 |
| 0.7138888888888889 | 3.525 |
| 0.7145833333333332 | 3.525 |
| 0.7152777777777778 | 0 |
| 0.7159722222222222 | 0 |
| 0.7166666666666667 | 0 |
| 0.717361111111111 | 0 |
| 0.7180555555555556 | 0 |
| 0.71875 | 0 |
| 0.7194444444444444 | 0 |
| 0.720138888888889 | 0 |
| 0.7208333333333333 | 0 |
| 0.7215277777777778 | 0 |
| 0.7222222222222222 | 0 |
| 0.7229166666666668 | 0 |
| 0.7236111111111111 | 0 |
| 0.7243055555555555 | 0 |
| 0.725 | 0 |
| 0.7256944444444445 | 0 |
| 0.7263888888888889 | 0 |
| 0.7270833333333333 | 3.525 |
| 0.7277777777777777 | 0 |
| 0.7284722222222223 | 3.525 |
| 0.7291666666666666 | 0 |
| 0.7298611111111111 | 0 |
| 0.7305555555555556 | 0 |
| 0.7312500000000001 | 3.525 |
| 0.7319444444444444 | 0 |
| 0.7326388888888888 | 0 |
| 0.7333333333333334 | 0 |
| 0.7340277777777778 | 0 |
| 0.7347222222222222 | 0 |
| 0.7354166666666666 | 0 |
| 0.7361111111111112 | 0 |
| 0.7368055555555556 | 0 |
| 0.7374999999999999 | 0 |
| 0.7381944444444444 | 0 |
| 0.7388888888888889 | 0 |
| 0.7395833333333334 | 0 |
| 0.7402777777777777 | 0 |
| 0.7409722222222223 | 0 |
| 0.7416666666666667 | 0 |
| 0.7423611111111111 | 0 |
| 0.7430555555555555 | 0 |
| 0.74375 | 0 |
| 0.7444444444444445 | 0 |
| 0.7451388888888889 | 0 |
| 0.7458333333333332 | 0 |
| 0.7465277777777778 | 0 |
| 0.7472222222222222 | 0 |
| 0.7479166666666667 | 0 |
| 0.748611111111111 | 0 |
| 0.7493055555555556 | 0 |
| 0.75 | 0 |
| 0.7506944444444444 | 0 |
| 0.751388888888889 | 0 |
| 0.7520833333333333 | 0 |
| 0.7527777777777778 | 0 |
| 0.7534722222222222 | 0 |
| 0.7541666666666668 | 0 |
| 0.7548611111111111 | 0 |
| 0.7555555555555555 | 0 |
| 0.75625 | 0 |
| 0.7569444444444445 | 0 |
| 0.7576388888888889 | 0 |
| 0.7583333333333333 | 0 |
| 0.7590277777777777 | 0 |
| 0.7597222222222223 | 0 |
| 0.7604166666666666 | 0 |
| 0.7611111111111111 | 0 |
| 0.7618055555555556 | 0 |
| 0.7625000000000001 | 0 |
| 0.7631944444444444 | 0 |
| 0.7638888888888888 | 0 |
| 0.7645833333333334 | 0 |
| 0.7652777777777778 | 0 |
| 0.7659722222222222 | 0 |
| 0.7666666666666666 | 0 |
| 0.7673611111111112 | 0 |
| 0.7680555555555556 | 0 |
| 0.7687499999999999 | 0 |
| 0.7694444444444444 | 0 |
| 0.7701388888888889 | 0 |
| 0.7708333333333334 | 0 |
| 0.7715277777777777 | 0 |
| 0.7722222222222223 | 0 |
| 0.7729166666666667 | 0 |
| 0.7736111111111111 | 0 |
| 0.7743055555555555 | 0 |
| 0.775 | 0 |
| 0.7756944444444445 | 0 |
| 0.7763888888888889 | 0 |
| 0.7770833333333332 | 0 |
| 0.7777777777777778 | 0 |
| 0.7784722222222222 | 0 |
| 0.7791666666666667 | 0 |
| 0.779861111111111 | 0 |
| 0.7805555555555556 | 0 |
| 0.78125 | 0 |
| 0.7819444444444444 | 0 |
| 0.782638888888889 | 0 |
| 0.7833333333333333 | 0 |
| 0.7840277777777778 | 0 |
| 0.7847222222222222 | 0 |
| 0.7854166666666668 | 0 |
| 0.7861111111111111 | 0 |
| 0.7868055555555555 | 0 |
| 0.7875 | 0 |
| 0.7881944444444445 | 0 |
| 0.7888888888888889 | 0 |
| 0.7895833333333333 | 0 |
| 0.7902777777777777 | 0 |
| 0.7909722222222223 | 0 |
| 0.7916666666666666 | 0 |
| 0.7923611111111111 | 0 |
| 0.7930555555555556 | 0 |
| 0.7937500000000001 | 0 |
| 0.7944444444444444 | 0 |
| 0.7951388888888888 | 0 |
| 0.7958333333333334 | 0 |
| 0.7965277777777778 | 0 |
| 0.7972222222222222 | 0 |
| 0.7979166666666666 | 0 |
| 0.7986111111111112 | 0 |
| 0.7993055555555556 | 0 |
| 0.7999999999999999 | 0 |
| 0.8006944444444444 | 0 |
| 0.8013888888888889 | 0 |
| 0.8020833333333334 | 0 |
| 0.8027777777777777 | 0 |
| 0.8034722222222223 | 0 |
| 0.8041666666666667 | 0 |
| 0.8048611111111111 | 0 |
| 0.8055555555555555 | 0 |
| 0.80625 | 0 |
| 0.8069444444444445 | 0 |
| 0.8076388888888889 | 0 |
| 0.8083333333333332 | 0 |
| 0.8090277777777778 | 0 |
| 0.8097222222222222 | 0 |
| 0.8104166666666667 | 0 |
| 0.811111111111111 | 0 |
| 0.8118055555555556 | 0 |
| 0.8125 | 0 |
| 0.8131944444444444 | 0 |
| 0.813888888888889 | 0 |
| 0.8145833333333333 | 0 |
| 0.8152777777777778 | 0 |
| 0.8159722222222222 | 0 |
| 0.8166666666666668 | 0 |
| 0.8173611111111111 | 0 |
| 0.8180555555555555 | 0 |
| 0.81875 | 0 |
| 0.8194444444444445 | 0 |
| 0.8201388888888889 | 0 |
| 0.8208333333333333 | 0 |
| 0.8215277777777777 | 0 |
| 0.8222222222222223 | 0 |
| 0.8229166666666666 | 0 |
| 0.8236111111111111 | 0 |
| 0.8243055555555556 | 0 |
| 0.8250000000000001 | 0 |
| 0.8256944444444444 | 0 |
| 0.8263888888888888 | 0 |
| 0.8270833333333334 | 0 |
| 0.8277777777777778 | 0 |
| 0.8284722222222222 | 0 |
| 0.8291666666666666 | 0 |
| 0.8298611111111112 | 0 |
| 0.8305555555555556 | 0 |
| 0.8312499999999999 | 0 |
| 0.8319444444444444 | 0 |
| 0.8326388888888889 | 0 |
| 0.8333333333333334 | 0 |
| 0.8340277777777777 | 0 |
| 0.8347222222222223 | 0 |
| 0.8354166666666667 | 0 |
| 0.8361111111111111 | 0 |
| 0.8368055555555555 | 0 |
| 0.8375 | 0 |
| 0.8381944444444445 | 0 |
| 0.8388888888888889 | 0 |
| 0.8395833333333332 | 0 |
| 0.8402777777777778 | 0 |
| 0.8409722222222222 | 0 |
| 0.8416666666666667 | 0 |
| 0.842361111111111 | 0 |
| 0.8430555555555556 | 0 |
| 0.84375 | 0 |
| 0.8444444444444444 | 0 |
| 0.845138888888889 | 0 |
| 0.8458333333333333 | 0 |
| 0.8465277777777778 | 0 |
| 0.8472222222222222 | 0 |
| 0.8479166666666668 | 0 |
| 0.8486111111111111 | 0 |
| 0.8493055555555555 | 0 |
| 0.85 | 0 |
| 0.8506944444444445 | 0 |
| 0.8513888888888889 | 0 |
| 0.8520833333333333 | 0 |
| 0.8527777777777777 | 0 |
| 0.8534722222222223 | 0 |
| 0.8541666666666666 | 0 |
| 0.8548611111111111 | 0 |
| 0.8555555555555556 | 0 |
| 0.8562500000000001 | 0 |
| 0.8569444444444444 | 0 |
| 0.8576388888888888 | 0 |
| 0.8583333333333334 | 0 |
| 0.8590277777777778 | 0 |
| 0.8597222222222222 | 0 |
| 0.8604166666666666 | 0 |
| 0.8611111111111112 | 0 |
| 0.8618055555555556 | 0 |
| 0.8624999999999999 | 0 |
| 0.8631944444444444 | 0 |
| 0.8638888888888889 | 0 |
| 0.8645833333333334 | 0 |
| 0.8652777777777777 | 0 |
| 0.8659722222222223 | 0 |
| 0.8666666666666667 | 0 |
| 0.8673611111111111 | 0 |
| 0.8680555555555555 | 0 |
| 0.86875 | 0 |
| 0.8694444444444445 | 0 |
| 0.8701388888888889 | 0 |
| 0.8708333333333332 | 0 |
| 0.8715277777777778 | 0 |
| 0.8722222222222222 | 0 |
| 0.8729166666666667 | 0 |
| 0.873611111111111 | 0 |
| 0.8743055555555556 | 0 |
| 0.875 | 0 |
| 0.8756944444444444 | 0 |
| 0.876388888888889 | 0 |
| 0.8770833333333333 | 0 |
| 0.8777777777777778 | 0 |
| 0.8784722222222222 | 0 |
| 0.8791666666666668 | 0 |
| 0.8798611111111111 | 0 |
| 0.8805555555555555 | 0 |
| 0.88125 | 0 |
| 0.8819444444444445 | 0 |
| 0.8826388888888889 | 0 |
| 0.8833333333333333 | 0 |
| 0.8840277777777777 | 0 |
| 0.8847222222222223 | 0 |
| 0.8854166666666666 | 0 |
| 0.8861111111111111 | 0 |
| 0.8868055555555556 | 0 |
| 0.8875000000000001 | 0 |
| 0.8881944444444444 | 0 |
| 0.8888888888888888 | 0 |
| 0.8895833333333334 | 0 |
| 0.8902777777777778 | 0 |
| 0.8909722222222222 | 0 |
| 0.8916666666666666 | 0 |
| 0.8923611111111112 | 0 |
| 0.8930555555555556 | 0 |
| 0.8937499999999999 | 0 |
| 0.8944444444444444 | 0 |
| 0.8951388888888889 | 0 |
| 0.8958333333333334 | 0 |
| 0.8965277777777777 | 0 |
| 0.8972222222222223 | 0 |
| 0.8979166666666667 | 0 |
| 0.8986111111111111 | 0 |
| 0.8993055555555555 | 0 |
| 0.9 | 0 |
| 0.9006944444444445 | 0 |
| 0.9013888888888889 | 0 |
| 0.9020833333333332 | 0 |
| 0.9027777777777778 | 0 |
| 0.9034722222222222 | 0 |
| 0.9041666666666667 | 0 |
| 0.904861111111111 | 0 |
| 0.9055555555555556 | 0 |
| 0.90625 | 0 |
| 0.9069444444444444 | 0 |
| 0.907638888888889 | 0 |
| 0.9083333333333333 | 0 |
| 0.9090277777777778 | 0 |
| 0.9097222222222222 | 0 |
| 0.9104166666666668 | 0 |
| 0.9111111111111111 | 0 |
| 0.9118055555555555 | 0 |
| 0.9125 | 0 |
| 0.9131944444444445 | 0 |
| 0.9138888888888889 | 0 |
| 0.9145833333333333 | 0 |
| 0.9152777777777777 | 0 |
| 0.9159722222222223 | 0 |
| 0.9166666666666666 | 0 |
| 0.9173611111111111 | 0 |
| 0.9180555555555556 | 0 |
| 0.9187500000000001 | 0 |
| 0.9194444444444444 | 0 |
| 0.9201388888888888 | 0 |
| 0.9208333333333334 | 0 |
| 0.9215277777777778 | 0 |
| 0.9222222222222222 | 0 |
| 0.9229166666666666 | 0 |
| 0.9236111111111112 | 0 |
| 0.9243055555555556 | 0 |
| 0.9249999999999999 | 0 |
| 0.9256944444444444 | 0 |
| 0.9263888888888889 | 0 |
| 0.9270833333333334 | 0 |
| 0.9277777777777777 | 0 |
| 0.9284722222222223 | 0 |
| 0.9291666666666667 | 0 |
| 0.9298611111111111 | 0 |
| 0.9305555555555555 | 0 |
| 0.93125 | 0 |
| 0.9319444444444445 | 0 |
| 0.9326388888888889 | 0 |
| 0.9333333333333332 | 0 |
| 0.9340277777777778 | 0 |
| 0.9347222222222222 | 0 |
| 0.9354166666666667 | 0 |
| 0.936111111111111 | 0 |
| 0.9368055555555556 | 0 |
| 0.9375 | 0 |
| 0.9381944444444444 | 0 |
| 0.938888888888889 | 0 |
| 0.9395833333333333 | 0 |
| 0.9402777777777778 | 0 |
| 0.9409722222222222 | 0 |
| 0.9416666666666668 | 0 |
| 0.9423611111111111 | 0 |
| 0.9430555555555555 | 0 |
| 0.94375 | 0 |
| 0.9444444444444445 | 0 |
| 0.9451388888888889 | 0 |
| 0.9458333333333333 | 0 |
| 0.9465277777777777 | 0 |
| 0.9472222222222223 | 0 |
| 0.9479166666666666 | 0 |
| 0.9486111111111111 | 0 |
| 0.9493055555555556 | 0 |
| 0.9500000000000001 | 0 |
| 0.9506944444444444 | 0 |
| 0.9513888888888888 | 0 |
| 0.9520833333333334 | 0 |
| 0.9527777777777778 | 0 |
| 0.9534722222222222 | 0 |
| 0.9541666666666666 | 0 |
| 0.9548611111111112 | 0 |
| 0.9555555555555556 | 0 |
| 0.9562499999999999 | 0 |
| 0.9569444444444444 | 0 |
| 0.9576388888888889 | 0 |
| 0.9583333333333334 | 0 |
| 0.9590277777777777 | 0 |
| 0.9597222222222223 | 0 |
| 0.9604166666666667 | 0 |
| 0.9611111111111111 | 0 |
| 0.9618055555555555 | 0 |
| 0.9625 | 0 |
| 0.9631944444444445 | 0 |
| 0.9638888888888889 | 0 |
| 0.9645833333333332 | 0 |
| 0.9652777777777778 | 0 |
| 0.9659722222222222 | 0 |
| 0.9666666666666667 | 0 |
| 0.967361111111111 | 0 |
| 0.9680555555555556 | 0 |
| 0.96875 | 0 |
| 0.9694444444444444 | 0 |
| 0.970138888888889 | 0 |
| 0.9708333333333333 | 0 |
| 0.9715277777777778 | 0 |
| 0.9722222222222222 | 0 |
| 0.9729166666666668 | 0 |
| 0.9736111111111111 | 0 |
| 0.9743055555555555 | 0 |
| 0.975 | 0 |
| 0.9756944444444445 | 0 |
| 0.9763888888888889 | 0 |
| 0.9770833333333333 | 0 |
| 0.9777777777777777 | 0 |
| 0.9784722222222223 | 0 |
| 0.9791666666666666 | 0 |
| 0.9798611111111111 | 0 |
| 0.9805555555555556 | 0 |
| 0.9812500000000001 | 0 |
| 0.9819444444444444 | 0 |
| 0.9826388888888888 | 0 |
| 0.9833333333333334 | 0 |
| 0.9840277777777778 | 0 |
| 0.9847222222222222 | 0 |
| 0.9854166666666666 | 0 |
| 0.9861111111111112 | 0 |
| 0.9868055555555556 | 0 |
| 0.9874999999999999 | 0 |
| 0.9881944444444444 | 0 |
| 0.9888888888888889 | 0 |
| 0.9895833333333334 | 0 |
| 0.9902777777777777 | 0 |
| 0.9909722222222223 | 0 |
| 0.9916666666666667 | 0 |
| 0.9923611111111111 | 0 |
| 0.9930555555555555 | 0 |
| 0.99375 | 0 |
| 0.9944444444444445 | 0 |
| 0.9951388888888889 | 0 |
| 0.9958333333333332 | 0 |
| 0.9965277777777778 | 0 |
| 0.9972222222222222 | 0 |
| 0.9979166666666667 | 0 |
| 0.998611111111111 | 0 |
| 0.9993055555555556 | 0 |